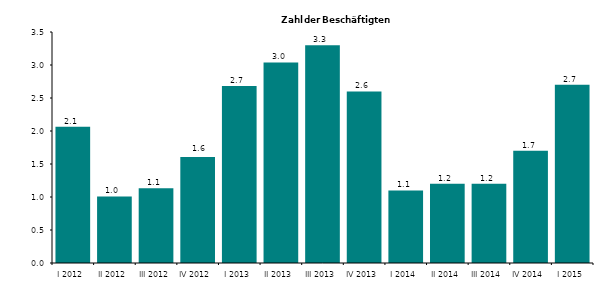
| Category | Series 0 |
|---|---|
| I 2012 | 2.063 |
| II 2012 | 1.009 |
| III 2012 | 1.132 |
| IV 2012 | 1.607 |
| I 2013 | 2.682 |
| II 2013 | 3.039 |
| III 2013 | 3.3 |
| IV 2013 | 2.6 |
| I 2014 | 1.1 |
| II 2014 | 1.2 |
| III 2014 | 1.2 |
| IV 2014 | 1.7 |
| I 2015 | 2.7 |